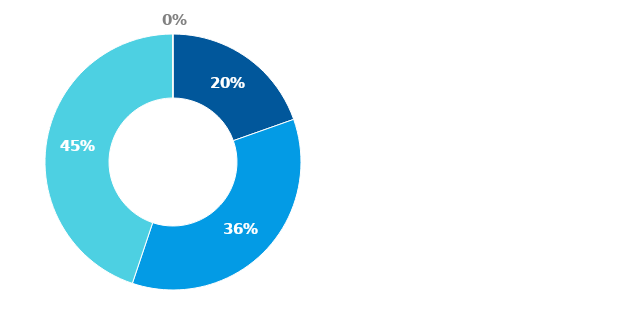
| Category | Series 0 |
|---|---|
| Hotovost | 0.196 |
| Půjčky poskytnuté nemovitostní společnosti | 0.355 |
| Majetkové účasti v nemovitostní společnosti | 0.448 |
| Ostatní finanční aktiva | 0 |